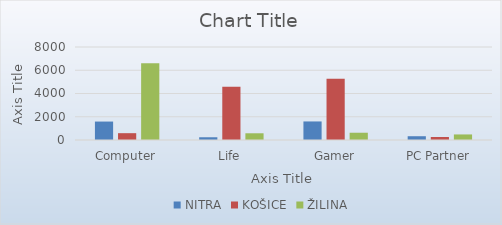
| Category | NITRA | KOŠICE | ŽILINA |
|---|---|---|---|
| Computer | 1587 | 587 | 6598 |
| Life | 236 | 4587 | 578 |
| Gamer | 1596 | 5263 | 625 |
| PC Partner | 325 | 256 | 478 |